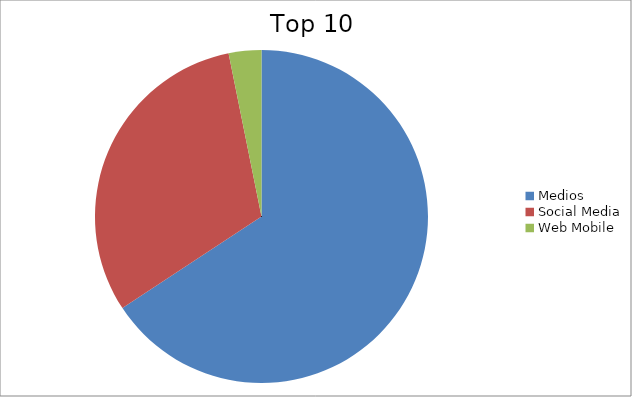
| Category | Series 0 |
|---|---|
| Medios | 65.73 |
| Social Media | 31.1 |
| Web Mobile | 3.17 |